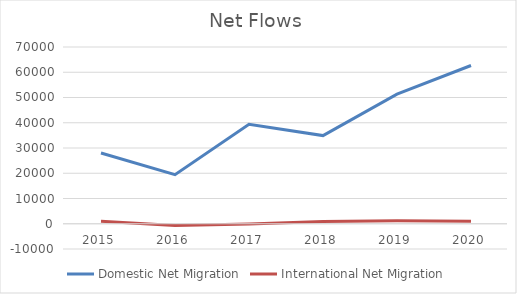
| Category | Domestic Net Migration | International Net Migration |
|---|---|---|
| 2015.0 | 28026 | 954 |
| 2016.0 | 19414 | -726 |
| 2017.0 | 39424 | -134 |
| 2018.0 | 34913 | 858 |
| 2019.0 | 51359 | 1161 |
| 2020.0 | 62667 | 941 |